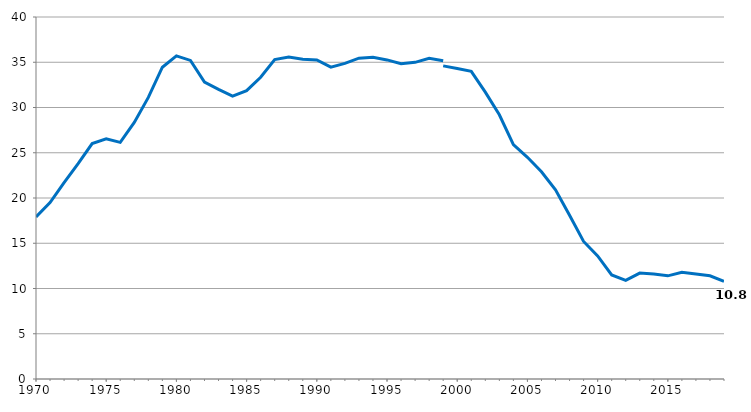
| Category | Series 0 |
|---|---|
| 1970.0 | 17.9 |
| 1971.0 | 19.5 |
| 1972.0 | 21.7 |
| 1973.0 | 23.8 |
| 1974.0 | 26.02 |
| 1975.0 | 26.55 |
| 1976.0 | 26.15 |
| 1977.0 | 28.35 |
| 1978.0 | 31.12 |
| 1979.0 | 34.45 |
| 1980.0 | 35.7 |
| 1981.0 | 35.2 |
| 1982.0 | 32.8 |
| 1983.0 | 32 |
| 1984.0 | 31.261 |
| 1985.0 | 31.865 |
| 1986.0 | 33.344 |
| 1987.0 | 35.303 |
| 1988.0 | 35.581 |
| 1989.0 | 35.34 |
| 1990.0 | 35.247 |
| 1991.0 | 34.453 |
| 1992.0 | 34.875 |
| 1993.0 | 35.446 |
| 1994.0 | 35.544 |
| 1995.0 | 35.258 |
| 1996.0 | 34.829 |
| 1997.0 | 34.99 |
| 1998.0 | 35.437 |
| 1999.0 | 35.169 |
| 1999.0 | 34.6 |
| 2000.0 | 34.3 |
| 2001.0 | 34 |
| 2002.0 | 31.7 |
| 2003.0 | 29.2 |
| 2004.0 | 25.9 |
| 2005.0 | 24.5 |
| 2006.0 | 22.9 |
| 2007.0 | 20.9 |
| 2008.0 | 18.1 |
| 2009.0 | 15.2 |
| 2010.0 | 13.6 |
| 2011.0 | 11.5 |
| 2011.0 | 11.4 |
| 2012.0 | 10.9 |
| 2013.0 | 11.7 |
| 2014.0 | 11.6 |
| 2015.0 | 11.4 |
| 2016.0 | 11.8 |
| 2017.0 | 11.6 |
| 2018.0 | 11.4 |
| 2019.0 | 10.8 |